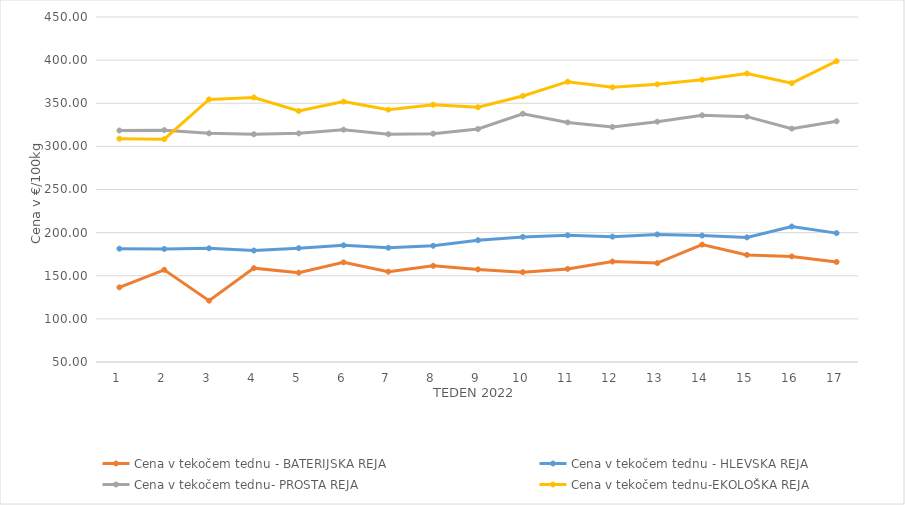
| Category | Cena v tekočem tednu - BATERIJSKA REJA | Cena v tekočem tednu - HLEVSKA REJA | Cena v tekočem tednu- PROSTA REJA | Cena v tekočem tednu-EKOLOŠKA REJA |
|---|---|---|---|---|
| 1.0 | 136.59 | 181.38 | 318.4 | 308.97 |
| 2.0 | 156.88 | 181.07 | 318.82 | 308.28 |
| 3.0 | 121.07 | 181.83 | 315.14 | 354.48 |
| 4.0 | 158.82 | 179.22 | 314.08 | 356.72 |
| 5.0 | 153.55 | 181.96 | 315.1 | 341.03 |
| 6.0 | 165.51 | 185.31 | 319.38 | 351.9 |
| 7.0 | 154.74 | 182.45 | 314.16 | 342.59 |
| 8.0 | 161.48 | 184.77 | 314.71 | 348.28 |
| 9.0 | 157.38 | 191.21 | 320.1 | 345.35 |
| 10.0 | 154.16 | 195.04 | 337.83 | 358.45 |
| 11.0 | 157.96 | 196.88 | 327.79 | 375 |
| 12.0 | 166.49 | 195.36 | 322.46 | 368.45 |
| 13.0 | 164.66 | 197.95 | 328.67 | 371.9 |
| 14.0 | 186.11 | 196.59 | 336.02 | 377.24 |
| 15.0 | 174.18 | 194.49 | 334.46 | 384.48 |
| 16.0 | 172.42 | 207.1 | 320.58 | 373.28 |
| 17.0 | 165.96 | 199.41 | 329.11 | 398.79 |